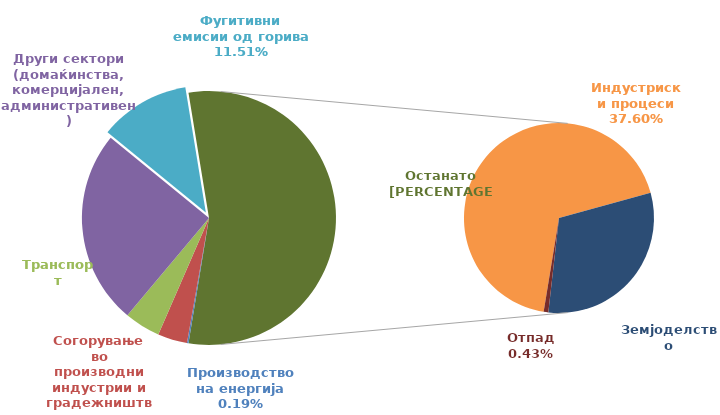
| Category | NMVOC |
|---|---|
| 0 | 0.043 |
| 1 | 0.839 |
| 2 | 1.022 |
| 3 | 5.537 |
| 4 | 2.571 |
| 5 | 8.396 |
| 6 | 3.826 |
| 7 | 0.097 |